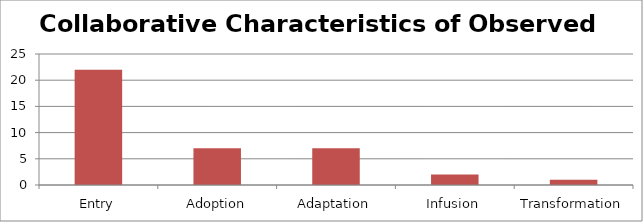
| Category | Collaborative |
|---|---|
| Entry | 22 |
| Adoption | 7 |
| Adaptation | 7 |
| Infusion | 2 |
| Transformation | 1 |